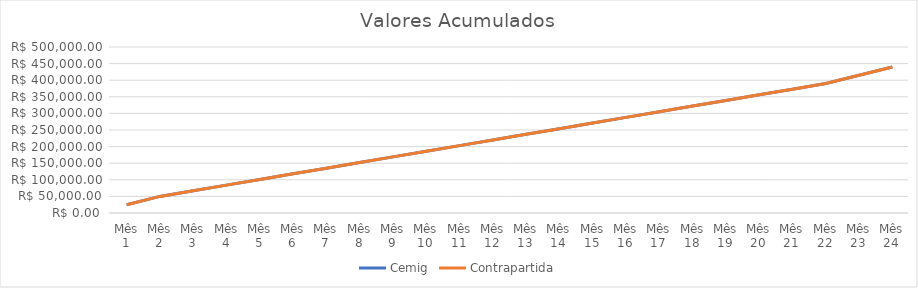
| Category | Cemig | Contrapartida |
|---|---|---|
| Mês 1 | 25000 | 0 |
| Mês 2 | 50000 | 0 |
| Mês 3 | 67000 | 0 |
| Mês 4 | 84000 | 0 |
| Mês 5 | 101000 | 0 |
| Mês 6 | 118000 | 0 |
| Mês 7 | 135000 | 0 |
| Mês 8 | 152000 | 0 |
| Mês 9 | 169000 | 0 |
| Mês 10 | 186000 | 0 |
| Mês 11 | 203000 | 0 |
| Mês 12 | 220000 | 0 |
| Mês 13 | 237000 | 0 |
| Mês 14 | 254000 | 0 |
| Mês 15 | 271000 | 0 |
| Mês 16 | 288000 | 0 |
| Mês 17 | 305000 | 0 |
| Mês 18 | 322000 | 0 |
| Mês 19 | 339000 | 0 |
| Mês 20 | 356000 | 0 |
| Mês 21 | 373000 | 0 |
| Mês 22 | 390000 | 0 |
| Mês 23 | 415000 | 0 |
| Mês 24 | 440000 | 0 |